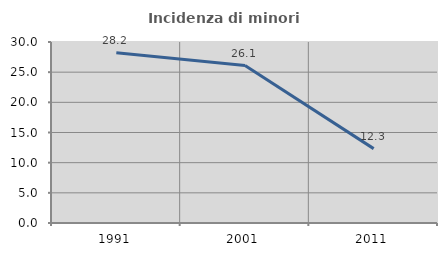
| Category | Incidenza di minori stranieri |
|---|---|
| 1991.0 | 28.205 |
| 2001.0 | 26.087 |
| 2011.0 | 12.329 |